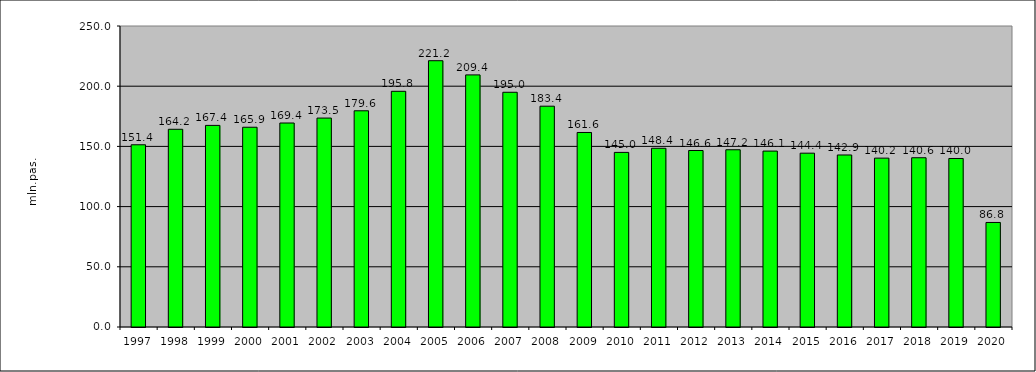
| Category | passengers transported (mill pas.) |
|---|---|
| 1997.0 | 151.353 |
| 1998.0 | 164.213 |
| 1999.0 | 167.439 |
| 2000.0 | 165.917 |
| 2001.0 | 169.429 |
| 2002.0 | 173.532 |
| 2003.0 | 179.572 |
| 2004.0 | 195.756 |
| 2005.0 | 221.168 |
| 2006.0 | 209.381 |
| 2007.0 | 194.955 |
| 2008.0 | 183.39 |
| 2009.0 | 161.559 |
| 2010.0 | 145.021 |
| 2011.0 | 148.448 |
| 2012.0 | 146.587 |
| 2013.0 | 147.216 |
| 2014.0 | 146.114 |
| 2015.0 | 144.374 |
| 2016.0 | 142.871 |
| 2017.0 | 140.249 |
| 2018.0 | 140.583 |
| 2019.0 | 139.955 |
| 2020.0 | 86.825 |